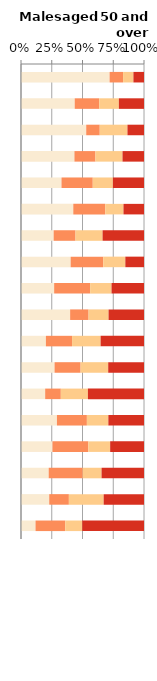
| Category | No qualifications | Below degree level qualifications | Other qualifications | Degree level qualifications |
|---|---|---|---|---|
| White Gypsy or Irish Traveller | 72.034 | 10.965 | 8.405 | 8.596 |
| White Irish | 43.675 | 19.896 | 15.992 | 20.437 |
| Bangladeshi | 53.017 | 11.003 | 22.526 | 13.454 |
| Pakistani | 43.441 | 17.081 | 22.014 | 17.464 |
| White British | 32.931 | 25.412 | 16.343 | 25.314 |
| Mixed White & Black Caribbean | 42.516 | 25.956 | 14.848 | 16.68 |
| Other | 26.534 | 17.785 | 22.003 | 33.678 |
| Black Caribbean | 40.372 | 26.454 | 17.992 | 15.182 |
| Other Black | 26.954 | 29.238 | 17.428 | 26.38 |
| Chinese | 39.944 | 14.987 | 16.263 | 28.806 |
| Other Asian | 20.236 | 21.262 | 23.238 | 35.263 |
| Indian | 27.28 | 21.184 | 22.446 | 29.09 |
| Arab | 19.651 | 12.722 | 22.021 | 45.606 |
| Other Mixed | 29.211 | 24.348 | 17.467 | 28.975 |
| Mixed White & Black African | 25.566 | 29.177 | 17.748 | 27.508 |
| Mixed White & Asian | 22.51 | 27.675 | 15.31 | 34.505 |
| Other White  | 22.941 | 15.986 | 28.283 | 32.791 |
| Black African | 11.807 | 24.164 | 13.823 | 50.205 |